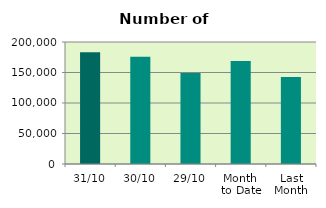
| Category | Series 0 |
|---|---|
| 31/10 | 183294 |
| 30/10 | 175746 |
| 29/10 | 149342 |
| Month 
to Date | 168717.043 |
| Last
Month | 142606.2 |